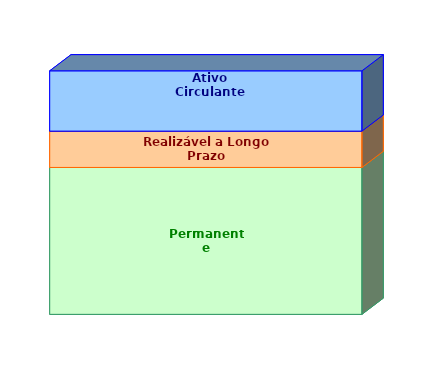
| Category | Permanente | Realizável a Longo Prazo | Ativo Circulante |
|---|---|---|---|
| 0 | 0.603 | 0.149 | 0.248 |